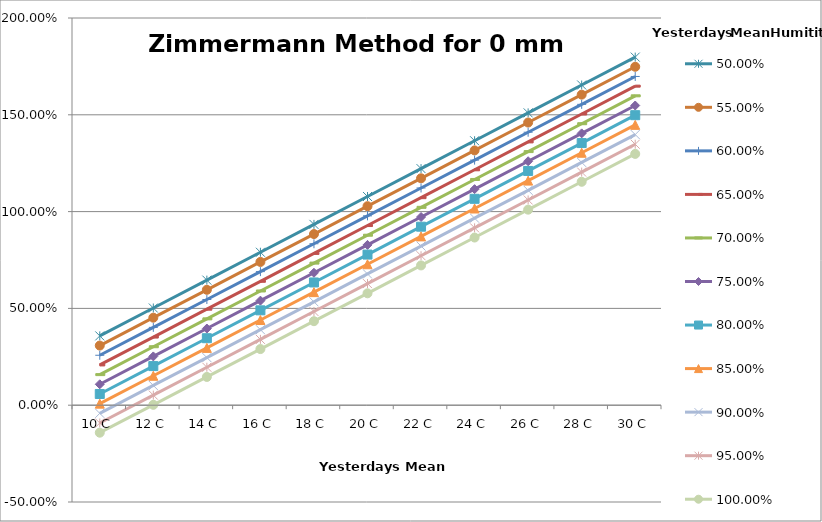
| Category | 50,00% | 55,00% | 60,00% | 65,00% | 70,00% | 75,00% | 80,00% | 85,00% | 90,00% | 95,00% | 100,00% |
|---|---|---|---|---|---|---|---|---|---|---|---|
| 10.0 | 0.358 | 0.308 | 0.258 | 0.208 | 0.158 | 0.108 | 0.058 | 0.008 | -0.042 | -0.092 | -0.142 |
| 12.0 | 0.502 | 0.452 | 0.402 | 0.352 | 0.302 | 0.252 | 0.202 | 0.152 | 0.102 | 0.052 | 0.002 |
| 14.0 | 0.646 | 0.596 | 0.546 | 0.496 | 0.446 | 0.396 | 0.346 | 0.296 | 0.246 | 0.196 | 0.146 |
| 16.0 | 0.79 | 0.74 | 0.69 | 0.64 | 0.59 | 0.54 | 0.49 | 0.44 | 0.39 | 0.34 | 0.29 |
| 18.0 | 0.934 | 0.884 | 0.834 | 0.784 | 0.734 | 0.684 | 0.634 | 0.584 | 0.534 | 0.484 | 0.434 |
| 20.0 | 1.078 | 1.028 | 0.978 | 0.928 | 0.878 | 0.828 | 0.778 | 0.728 | 0.678 | 0.628 | 0.578 |
| 22.0 | 1.222 | 1.172 | 1.122 | 1.072 | 1.022 | 0.972 | 0.922 | 0.872 | 0.822 | 0.772 | 0.722 |
| 24.0 | 1.366 | 1.316 | 1.266 | 1.216 | 1.166 | 1.116 | 1.066 | 1.016 | 0.966 | 0.916 | 0.866 |
| 26.0 | 1.51 | 1.46 | 1.41 | 1.36 | 1.31 | 1.26 | 1.21 | 1.16 | 1.11 | 1.06 | 1.01 |
| 28.0 | 1.654 | 1.604 | 1.554 | 1.504 | 1.454 | 1.404 | 1.354 | 1.304 | 1.254 | 1.204 | 1.154 |
| 30.0 | 1.798 | 1.748 | 1.698 | 1.648 | 1.598 | 1.548 | 1.498 | 1.448 | 1.398 | 1.348 | 1.298 |